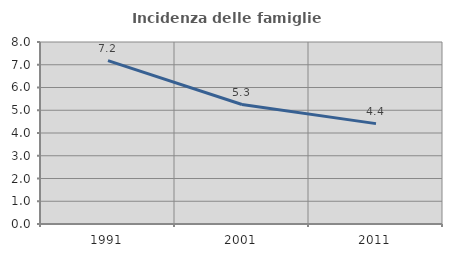
| Category | Incidenza delle famiglie numerose |
|---|---|
| 1991.0 | 7.182 |
| 2001.0 | 5.251 |
| 2011.0 | 4.412 |